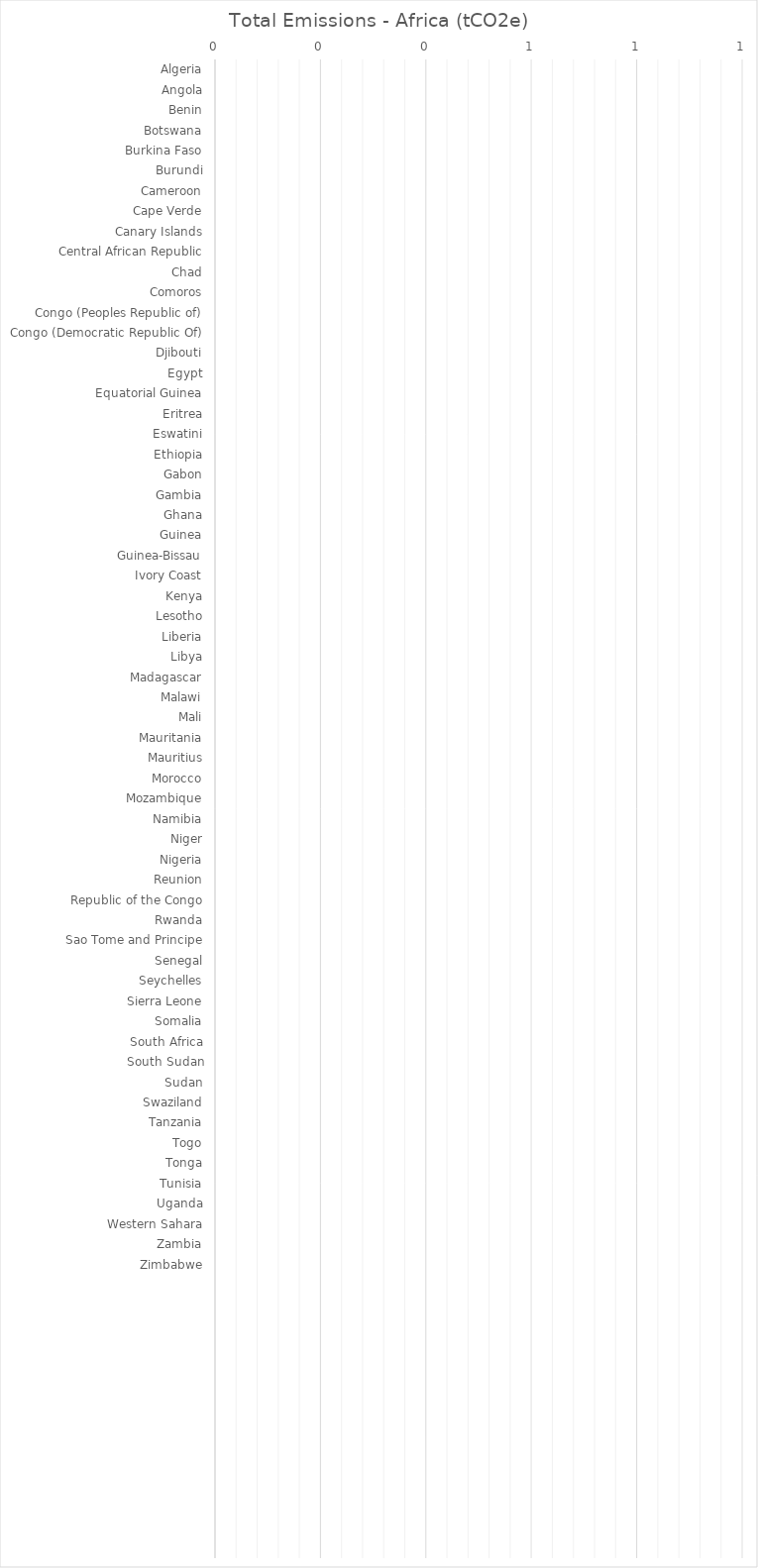
| Category | Total Emissions - Africa (tCO2e) |
|---|---|
| Algeria | 0 |
| Angola | 0 |
| Benin | 0 |
| Botswana | 0 |
| Burkina Faso | 0 |
| Burundi | 0 |
| Cameroon | 0 |
| Cape Verde | 0 |
| Canary Islands | 0 |
| Central African Republic | 0 |
| Chad | 0 |
| Comoros | 0 |
| Congo (Peoples Republic of) | 0 |
| Congo (Democratic Republic Of) | 0 |
| Djibouti | 0 |
| Egypt | 0 |
| Equatorial Guinea | 0 |
| Eritrea | 0 |
| Eswatini | 0 |
| Ethiopia | 0 |
| Gabon | 0 |
| Gambia | 0 |
| Ghana | 0 |
| Guinea | 0 |
| Guinea-Bissau | 0 |
| Ivory Coast | 0 |
| Kenya | 0 |
| Lesotho | 0 |
| Liberia | 0 |
| Libya | 0 |
| Madagascar | 0 |
| Malawi | 0 |
| Mali | 0 |
| Mauritania | 0 |
| Mauritius | 0 |
| Morocco | 0 |
| Mozambique | 0 |
| Namibia | 0 |
| Niger | 0 |
| Nigeria | 0 |
| Reunion | 0 |
| Republic of the Congo | 0 |
| Rwanda | 0 |
| Sao Tome and Principe | 0 |
| Senegal | 0 |
| Seychelles | 0 |
| Sierra Leone | 0 |
| Somalia | 0 |
| South Africa | 0 |
| South Sudan | 0 |
| Sudan | 0 |
| Swaziland | 0 |
| Tanzania | 0 |
| Togo | 0 |
| Tonga | 0 |
| Tunisia | 0 |
| Uganda | 0 |
| Western Sahara | 0 |
| Zambia | 0 |
| Zimbabwe | 0 |